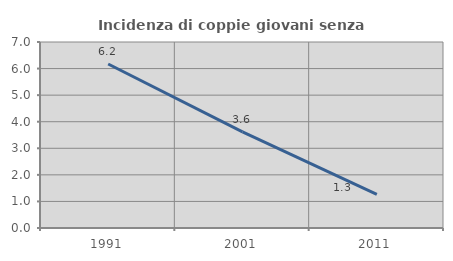
| Category | Incidenza di coppie giovani senza figli |
|---|---|
| 1991.0 | 6.173 |
| 2001.0 | 3.614 |
| 2011.0 | 1.266 |